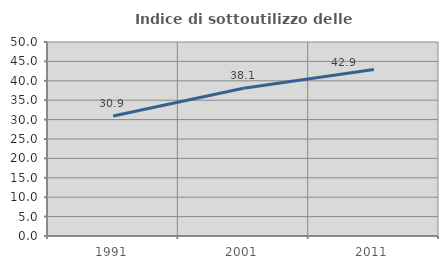
| Category | Indice di sottoutilizzo delle abitazioni  |
|---|---|
| 1991.0 | 30.924 |
| 2001.0 | 38.077 |
| 2011.0 | 42.938 |